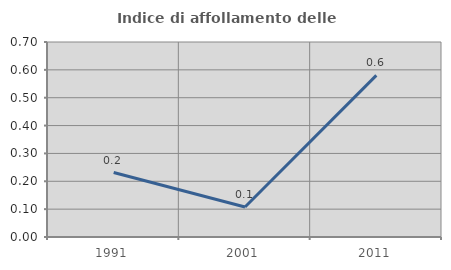
| Category | Indice di affollamento delle abitazioni  |
|---|---|
| 1991.0 | 0.231 |
| 2001.0 | 0.108 |
| 2011.0 | 0.58 |